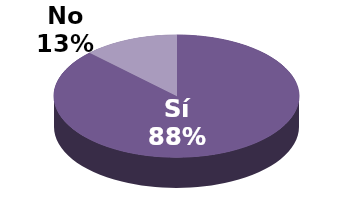
| Category | Series 1 |
|---|---|
| Sí | 21 |
| No | 3 |